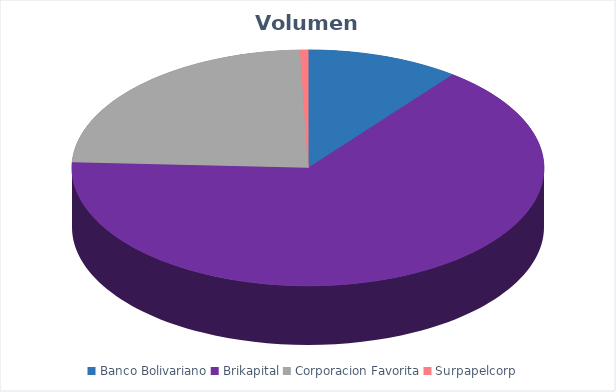
| Category | VOLUMEN ($USD) |
|---|---|
| Banco Bolivariano | 9468.9 |
| Brikapital | 59000 |
| Corporacion Favorita | 21403.79 |
| Surpapelcorp | 488.75 |